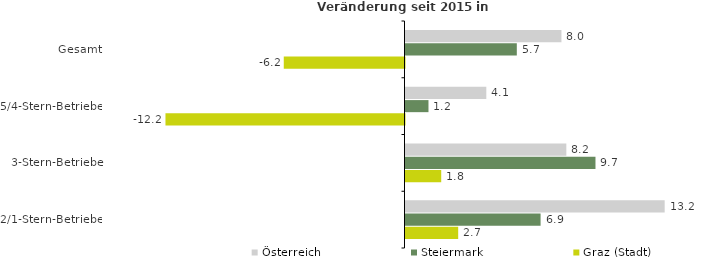
| Category | Österreich | Steiermark | Graz (Stadt) |
|---|---|---|---|
| Gesamt | 7.97 | 5.689 | -6.17 |
| 5/4-Stern-Betriebe | 4.13 | 1.174 | -12.216 |
| 3-Stern-Betriebe | 8.22 | 9.709 | 1.825 |
| 2/1-Stern-Betriebe | 13.246 | 6.904 | 2.693 |